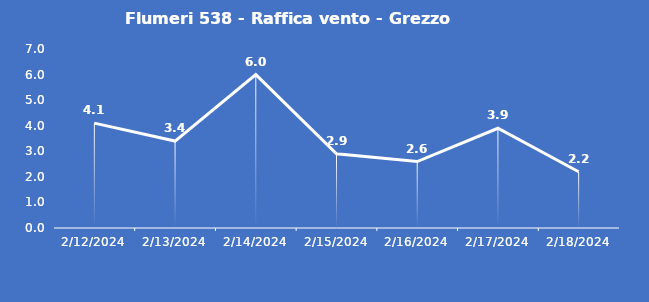
| Category | Flumeri 538 - Raffica vento - Grezzo (m/s) |
|---|---|
| 2/12/24 | 4.1 |
| 2/13/24 | 3.4 |
| 2/14/24 | 6 |
| 2/15/24 | 2.9 |
| 2/16/24 | 2.6 |
| 2/17/24 | 3.9 |
| 2/18/24 | 2.2 |